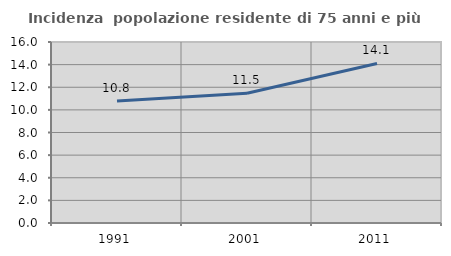
| Category | Incidenza  popolazione residente di 75 anni e più |
|---|---|
| 1991.0 | 10.78 |
| 2001.0 | 11.467 |
| 2011.0 | 14.101 |